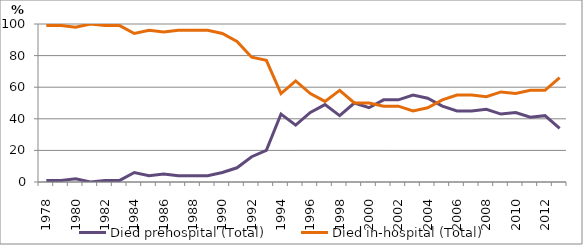
| Category | Died prehospital (Total) | Died in-hospital (Total) |
|---|---|---|
| 1978.0 | 1 | 99 |
| 1979.0 | 1 | 99 |
| 1980.0 | 2 | 98 |
| 1981.0 | 0 | 100 |
| 1982.0 | 1 | 99 |
| 1983.0 | 1 | 99 |
| 1984.0 | 6 | 94 |
| 1985.0 | 4 | 96 |
| 1986.0 | 5 | 95 |
| 1987.0 | 4 | 96 |
| 1988.0 | 4 | 96 |
| 1989.0 | 4 | 96 |
| 1990.0 | 6 | 94 |
| 1991.0 | 9 | 89 |
| 1992.0 | 16 | 79 |
| 1993.0 | 20 | 77 |
| 1994.0 | 43 | 56 |
| 1995.0 | 36 | 64 |
| 1996.0 | 44 | 56 |
| 1997.0 | 49 | 51 |
| 1998.0 | 42 | 58 |
| 1999.0 | 50 | 50 |
| 2000.0 | 47 | 50 |
| 2001.0 | 52 | 48 |
| 2002.0 | 52 | 48 |
| 2003.0 | 55 | 45 |
| 2004.0 | 53 | 47 |
| 2005.0 | 48 | 52 |
| 2006.0 | 45 | 55 |
| 2007.0 | 45 | 55 |
| 2008.0 | 46 | 54 |
| 2009.0 | 43 | 57 |
| 2010.0 | 44 | 56 |
| 2011.0 | 41 | 58 |
| 2012.0 | 42 | 58 |
| 2013.0 | 34 | 66 |